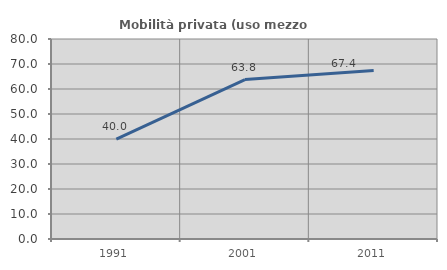
| Category | Mobilità privata (uso mezzo privato) |
|---|---|
| 1991.0 | 39.964 |
| 2001.0 | 63.766 |
| 2011.0 | 67.399 |